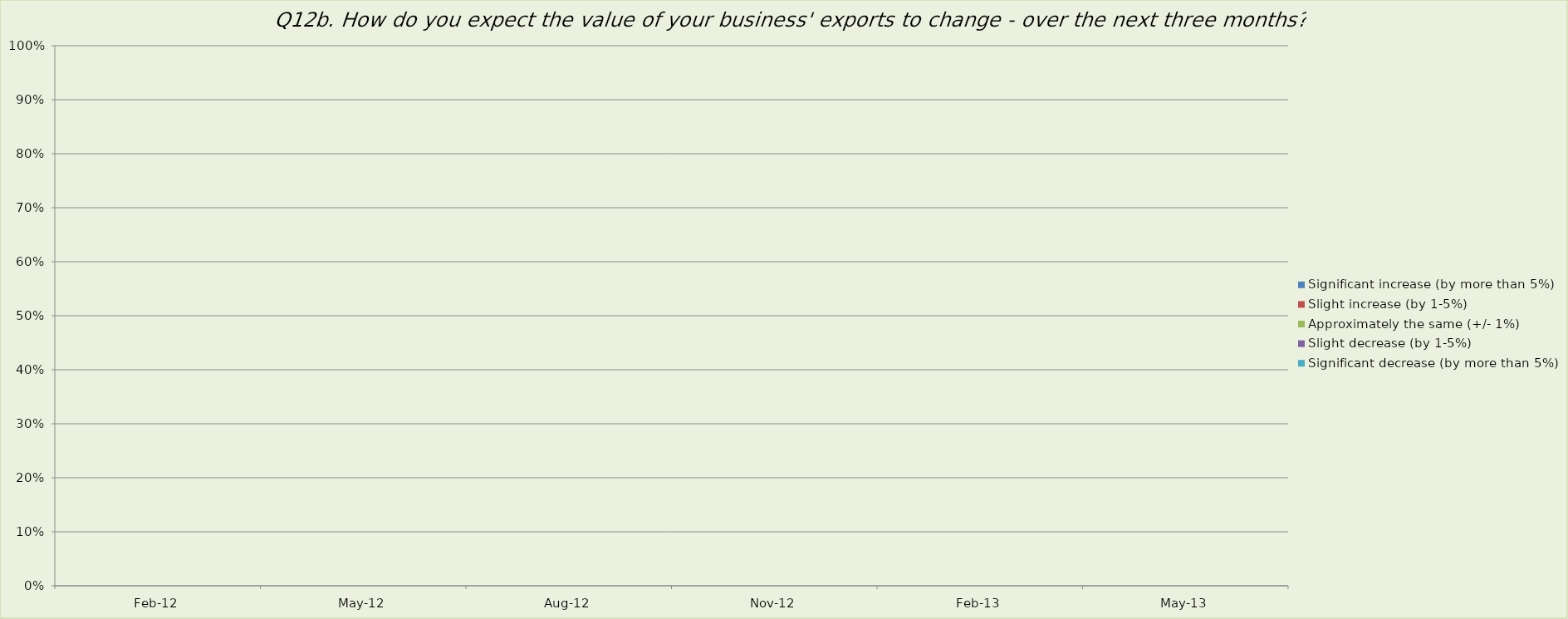
| Category | Significant increase (by more than 5%) | Slight increase (by 1-5%) | Approximately the same (+/- 1%) | Slight decrease (by 1-5%) | Significant decrease (by more than 5%) |
|---|---|---|---|---|---|
| 2012-02-01 | 0 | 0 | 0 | 0 | 0 |
| 2012-05-01 | 0 | 0 | 0 | 0 | 0 |
| 2012-08-01 | 0 | 0 | 0 | 0 | 0 |
| 2012-11-01 | 0 | 0 | 0 | 0 | 0 |
| 2013-02-01 | 0 | 0 | 0 | 0 | 0 |
| 2013-05-01 | 0 | 0 | 0 | 0 | 0 |